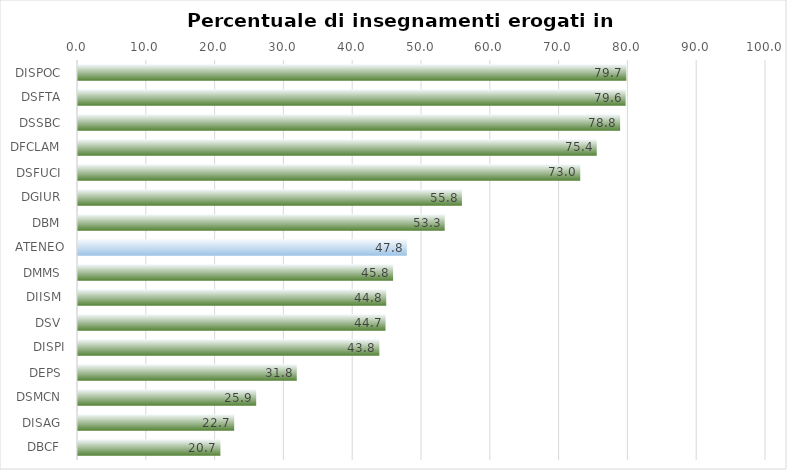
| Category | Series 0 |
|---|---|
| DISPOC  | 79.7 |
| DSFTA  | 79.6 |
| DSSBC  | 78.8 |
| DFCLAM  | 75.4 |
| DSFUCI  | 73 |
| DGIUR  | 55.8 |
| DBM  | 53.3 |
| ATENEO | 47.8 |
| DMMS  | 45.8 |
| DIISM  | 44.8 |
| DSV  | 44.7 |
| DISPI | 43.8 |
| DEPS  | 31.8 |
| DSMCN  | 25.9 |
| DISAG  | 22.7 |
| DBCF  | 20.7 |